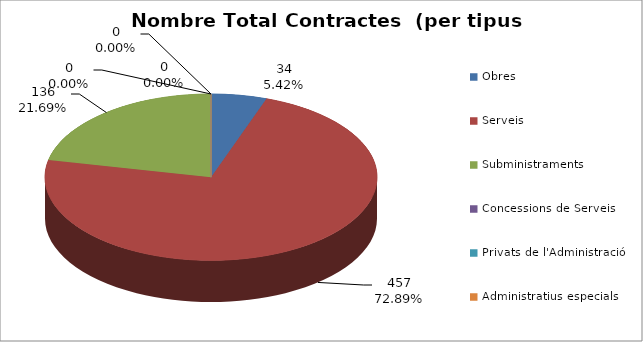
| Category | Nombre Total Contractes |
|---|---|
| Obres | 34 |
| Serveis | 457 |
| Subministraments | 136 |
| Concessions de Serveis | 0 |
| Privats de l'Administració | 0 |
| Administratius especials | 0 |